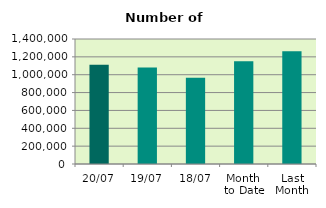
| Category | Series 0 |
|---|---|
| 20/07 | 1112758 |
| 19/07 | 1081980 |
| 18/07 | 965994 |
| Month 
to Date | 1149931 |
| Last
Month | 1263143.455 |